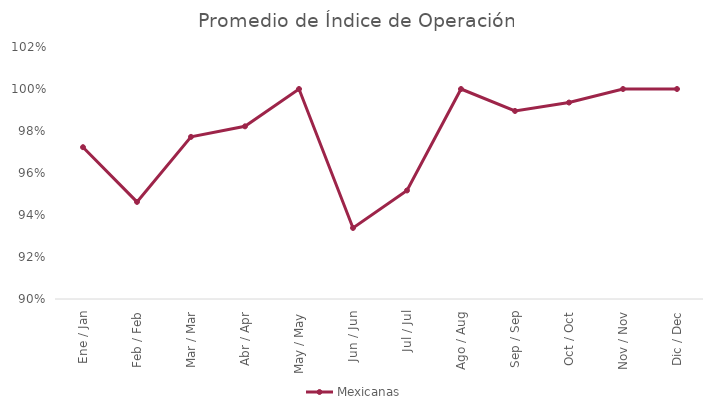
| Category | Mexicanas |
|---|---|
| Ene / Jan | 0.972 |
| Feb / Feb | 0.946 |
| Mar / Mar | 0.977 |
| Abr / Apr | 0.982 |
| May / May | 1 |
| Jun / Jun | 0.934 |
| Jul / Jul | 0.952 |
| Ago / Aug | 1 |
| Sep / Sep | 0.99 |
| Oct / Oct | 0.994 |
| Nov / Nov | 1 |
| Dic / Dec | 1 |